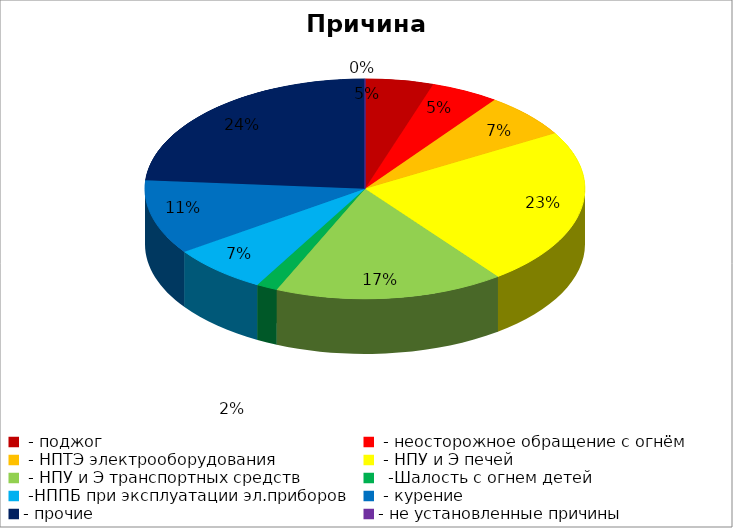
| Category | Причина пожара |
|---|---|
|  - поджог | 16 |
|  - неосторожное обращение с огнём | 16 |
|  - НПТЭ электрооборудования | 21 |
|  - НПУ и Э печей | 74 |
|  - НПУ и Э транспортных средств | 54 |
|   -Шалость с огнем детей | 5 |
|  -НППБ при эксплуатации эл.приборов | 23 |
|  - курение | 35 |
| - прочие | 76 |
| - не установленные причины | 0 |